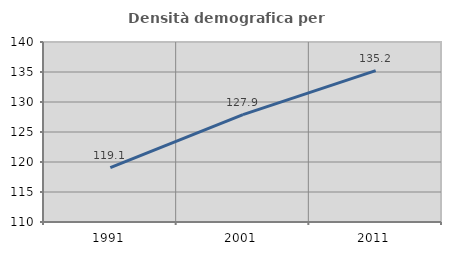
| Category | Densità demografica |
|---|---|
| 1991.0 | 119.068 |
| 2001.0 | 127.903 |
| 2011.0 | 135.231 |